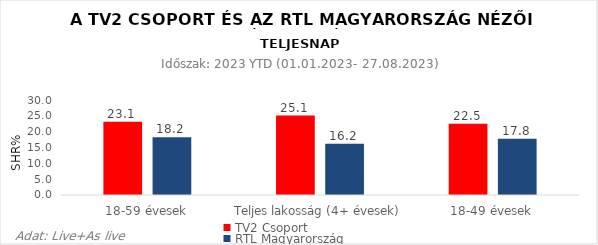
| Category | TV2 Csoport | RTL Magyarország |
|---|---|---|
| 18-59 évesek | 23.1 | 18.2 |
| Teljes lakosság (4+ évesek) | 25.1 | 16.2 |
| 18-49 évesek | 22.5 | 17.8 |